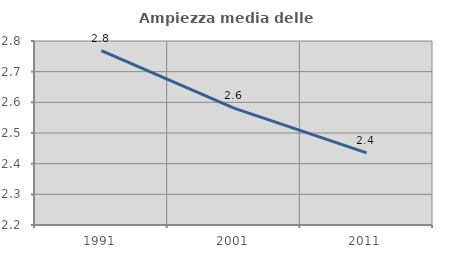
| Category | Ampiezza media delle famiglie |
|---|---|
| 1991.0 | 2.769 |
| 2001.0 | 2.581 |
| 2011.0 | 2.435 |